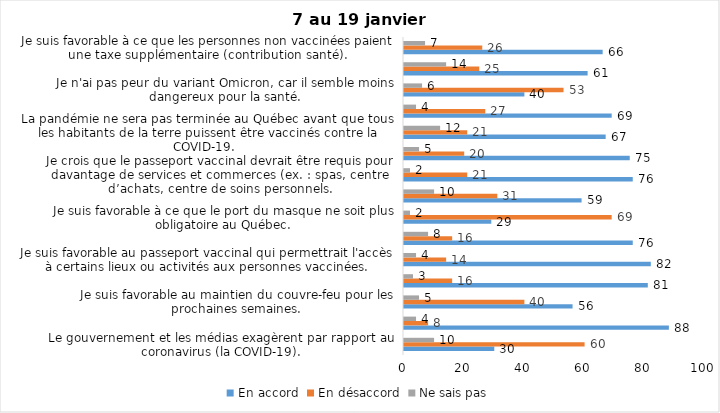
| Category | En accord | En désaccord | Ne sais pas |
|---|---|---|---|
| Le gouvernement et les médias exagèrent par rapport au coronavirus (la COVID-19). | 30 | 60 | 10 |
| J’ai peur que le système de santé soit débordé par les cas de COVID-19. | 88 | 8 | 4 |
| Je suis favorable au maintien du couvre-feu pour les prochaines semaines. | 56 | 40 | 5 |
| Je suis inquiet/inquiète que le nombre de cas augmente en raison des nouveaux variants du virus de la COVID-19. | 81 | 16 | 3 |
| Je suis favorable au passeport vaccinal qui permettrait l'accès à certains lieux ou activités aux personnes vaccinées. | 82 | 14 | 4 |
| Je suis confiant que la vaccination protège efficacement contre les variants de la COVID-19 | 76 | 16 | 8 |
| Je suis favorable à ce que le port du masque ne soit plus obligatoire au Québec. | 29 | 69 | 2 |
| J'ai peur que la reprise des cours en présentiel dans les écoles primaires et secondaires génère une augmentation des cas de COVID-19 | 59 | 31 | 10 |
| Je crois que le passeport vaccinal devrait être requis pour davantage de services et commerces (ex. : spas, centre d’achats, centre de soins personnels. | 76 | 21 | 2 |
| Les personnes non adéquatement vaccinées contre la COVID-19 sont responsables des nouveaux cas et hospitalisations et contribuent à la prolongation de la pandémie au Québec. | 75 | 20 | 5 |
| La pandémie ne sera pas terminée au Québec avant que tous les habitants de la terre puissent être vaccinés contre la COVID-19.   | 67 | 21 | 12 |
| Je suis inconfortable d’être en contact avec une personne non vaccinée contre la COVID-19 | 69 | 27 | 4 |
| Je n'ai pas peur du variant Omicron, car il semble moins dangereux pour la santé. | 40 | 53 | 6 |
| La vaccination obligatoire contre la COVID-19 mettrait fin à la pandémie. | 61 | 25 | 14 |
| Je suis favorable à ce que les personnes non vaccinées paient une taxe supplémentaire (contribution santé). | 66 | 26 | 7 |